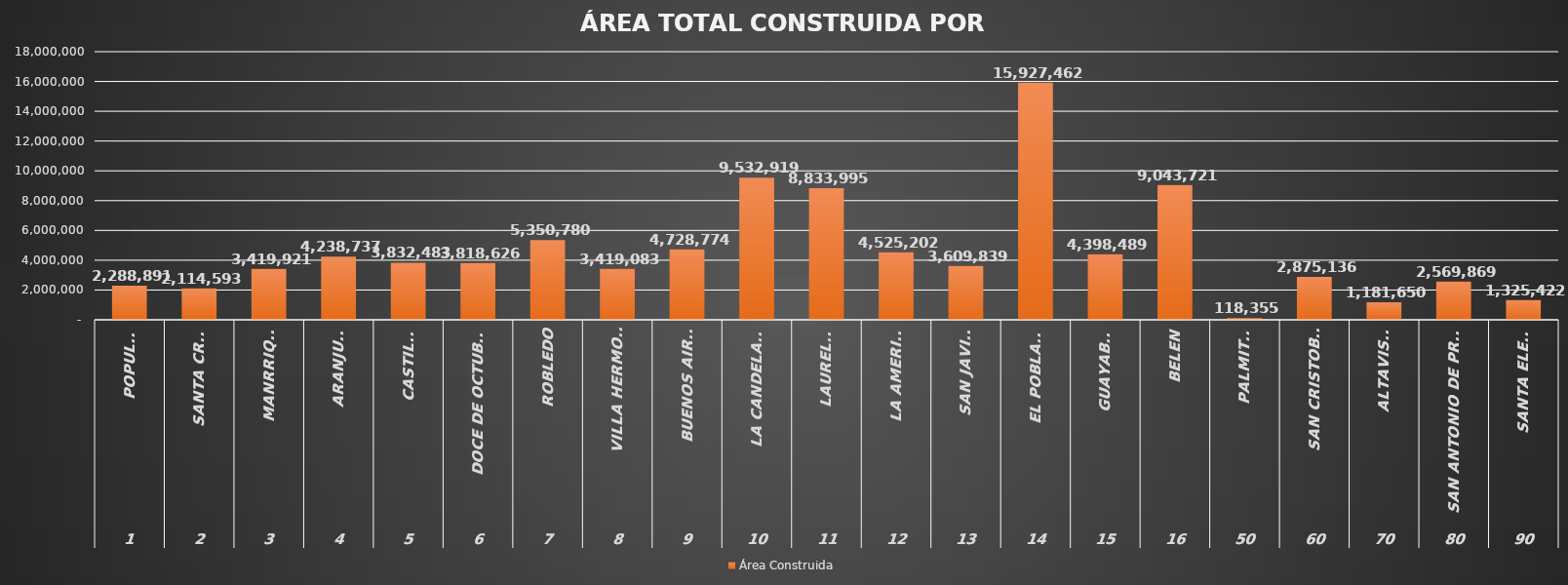
| Category | Área Construida |
|---|---|
| 0 | 2288891 |
| 1 | 2114593 |
| 2 | 3419921 |
| 3 | 4238737 |
| 4 | 3832483 |
| 5 | 3818626 |
| 6 | 5350780 |
| 7 | 3419083 |
| 8 | 4728774 |
| 9 | 9532919 |
| 10 | 8833995 |
| 11 | 4525202 |
| 12 | 3609839 |
| 13 | 15927462 |
| 14 | 4398489 |
| 15 | 9043721 |
| 16 | 118355 |
| 17 | 2875136 |
| 18 | 1181650 |
| 19 | 2569869 |
| 20 | 1325422 |